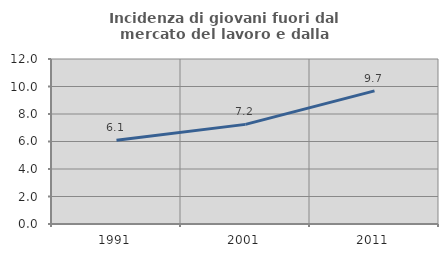
| Category | Incidenza di giovani fuori dal mercato del lavoro e dalla formazione  |
|---|---|
| 1991.0 | 6.098 |
| 2001.0 | 7.245 |
| 2011.0 | 9.683 |